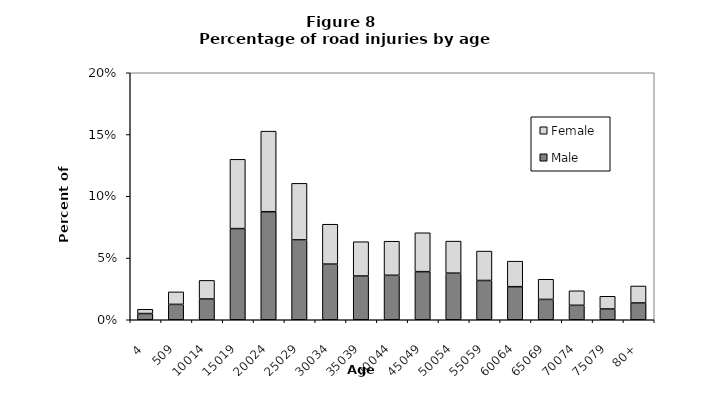
| Category | Male | Female |
|---|---|---|
| 4 | 0.005 | 0.003 |
| 509 | 0.012 | 0.01 |
| 10014 | 0.017 | 0.015 |
| 15019 | 0.074 | 0.056 |
| 20024 | 0.087 | 0.065 |
| 25029 | 0.065 | 0.046 |
| 30034 | 0.045 | 0.032 |
| 35039 | 0.035 | 0.028 |
| 40044 | 0.036 | 0.028 |
| 45049 | 0.039 | 0.031 |
| 50054 | 0.038 | 0.026 |
| 55059 | 0.032 | 0.024 |
| 60064 | 0.027 | 0.021 |
| 65069 | 0.016 | 0.016 |
| 70074 | 0.012 | 0.012 |
| 75079 | 0.009 | 0.01 |
| 80+ | 0.014 | 0.014 |